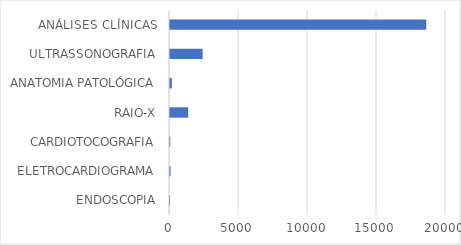
| Category | Series 0 |
|---|---|
| ENDOSCOPIA | 8 |
| ELETROCARDIOGRAMA | 44 |
| CARDIOTOCOGRAFIA | 18 |
| RAIO-X | 1321 |
| ANATOMIA PATOLÓGICA | 135 |
| ULTRASSONOGRAFIA | 2364 |
| ANÁLISES CLÍNICAS | 18568 |